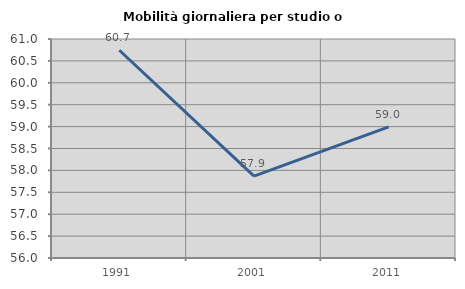
| Category | Mobilità giornaliera per studio o lavoro |
|---|---|
| 1991.0 | 60.743 |
| 2001.0 | 57.868 |
| 2011.0 | 58.992 |